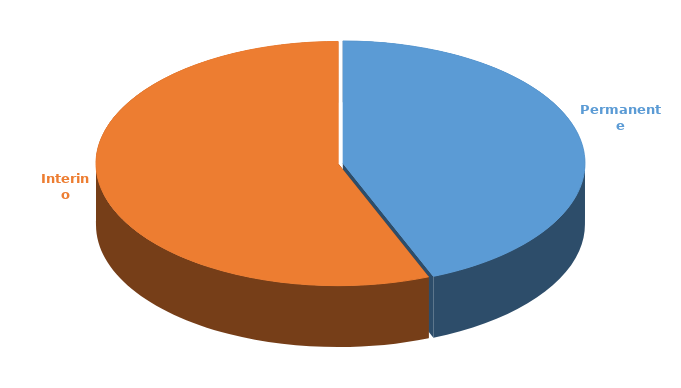
| Category | Cantidad |
|---|---|
| Permanente | 2719 |
| Interino | 3475 |